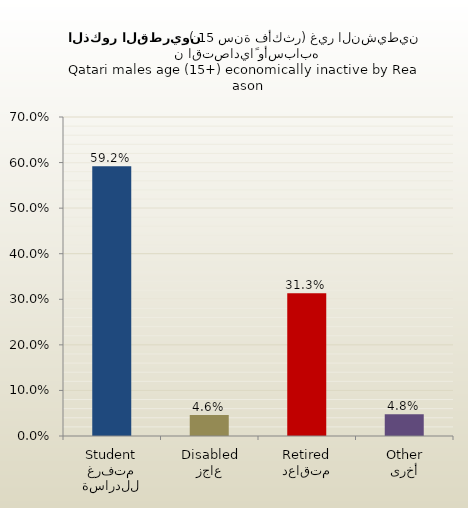
| Category | الذكور القطريين |
|---|---|
| متفرغ للدراسة
Student | 0.592 |
| عاجز
Disabled | 0.046 |
| متقاعد
Retired | 0.313 |
| أخرى
Other | 0.048 |